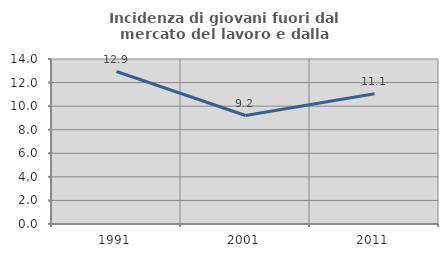
| Category | Incidenza di giovani fuori dal mercato del lavoro e dalla formazione  |
|---|---|
| 1991.0 | 12.936 |
| 2001.0 | 9.204 |
| 2011.0 | 11.054 |